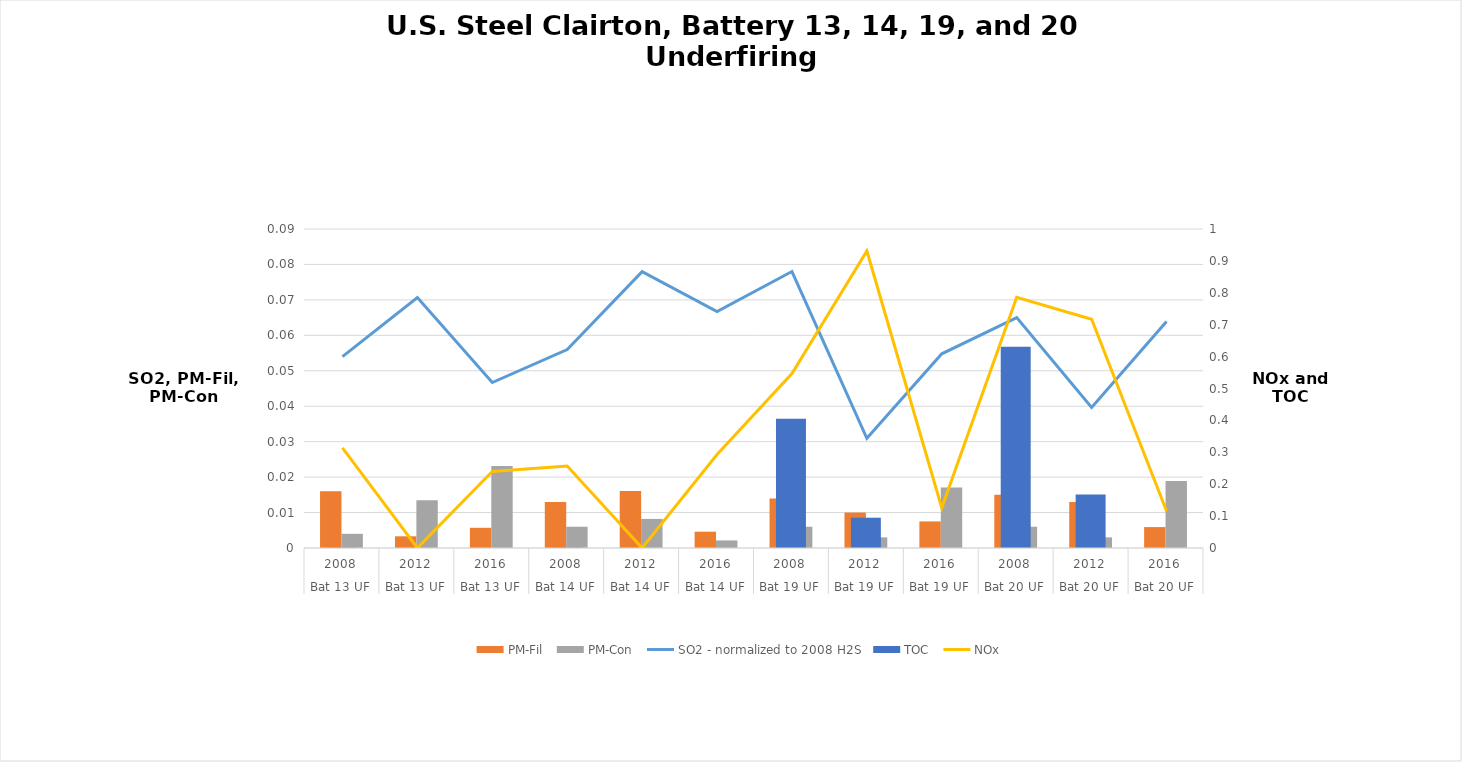
| Category | PM-Fil | PM-Con |
|---|---|---|
| 0 | 0.016 | 0.004 |
| 1 | 0.003 | 0.014 |
| 2 | 0.006 | 0.023 |
| 3 | 0.013 | 0.006 |
| 4 | 0.016 | 0.008 |
| 5 | 0.005 | 0.002 |
| 6 | 0.014 | 0.006 |
| 7 | 0.01 | 0.003 |
| 8 | 0.008 | 0.017 |
| 9 | 0.015 | 0.006 |
| 10 | 0.013 | 0.003 |
| 11 | 0.006 | 0.019 |